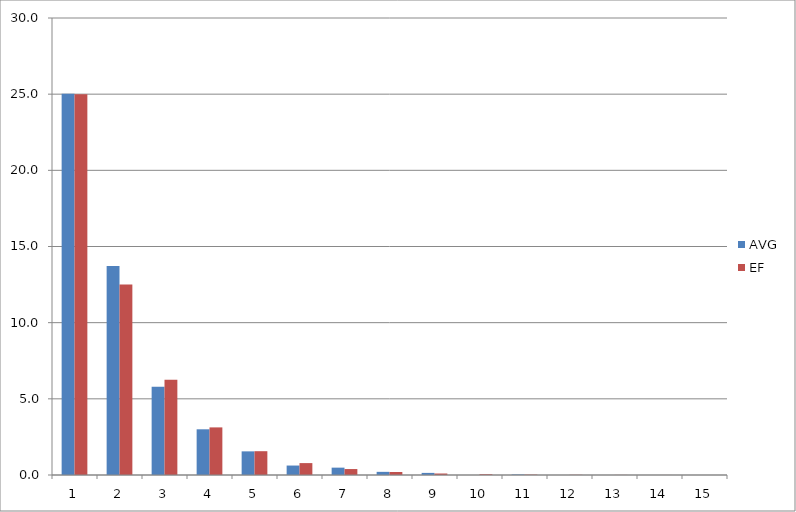
| Category | AVG | EF |
|---|---|---|
| 0 | 25.034 | 25 |
| 1 | 13.724 | 12.5 |
| 2 | 5.793 | 6.25 |
| 3 | 3 | 3.125 |
| 4 | 1.552 | 1.562 |
| 5 | 0.621 | 0.781 |
| 6 | 0.483 | 0.391 |
| 7 | 0.207 | 0.195 |
| 8 | 0.138 | 0.098 |
| 9 | 0 | 0.049 |
| 10 | 0.034 | 0.024 |
| 11 | 0 | 0.012 |
| 12 | 0 | 0.006 |
| 13 | 0 | 0.003 |
| 14 | 0 | 0.002 |